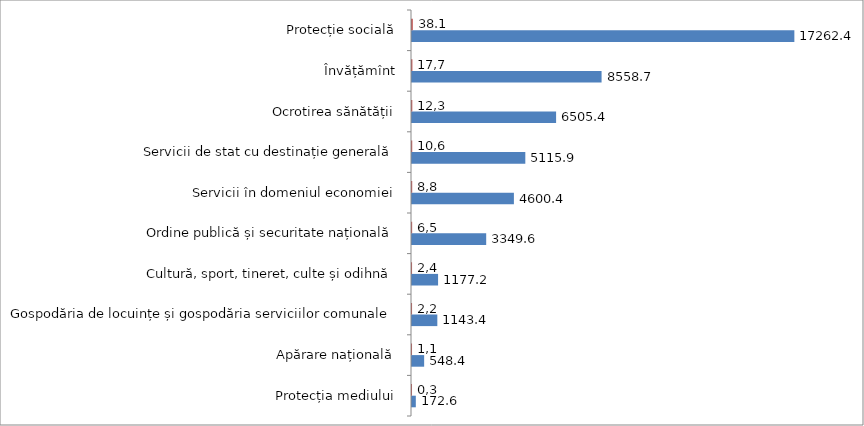
| Category | Series 0 | Series 1 |
|---|---|---|
| Protecția mediului | 172.6 | 0.356 |
| Apărare națională | 548.4 | 1.132 |
| Gospodăria de locuințe și gospodăria serviciilor comunale | 1143.4 | 2.361 |
| Cultură, sport, tineret, culte și odihnă | 1177.2 | 2.431 |
| Ordine publică și securitate națională | 3349.6 | 6.916 |
| Servicii în domeniul economiei | 4600.4 | 9.498 |
| Servicii de stat cu destinație generală | 5115.9 | 10.563 |
| Ocrotirea sănătății | 6505.4 | 13.431 |
| Învățămînt | 8558.7 | 17.671 |
| Protecție socială | 17262.4 | 35.641 |